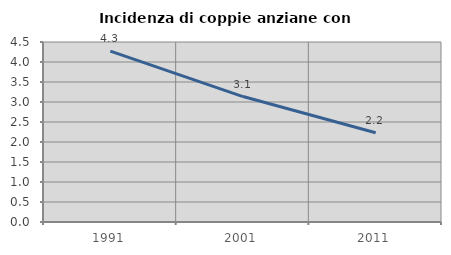
| Category | Incidenza di coppie anziane con figli |
|---|---|
| 1991.0 | 4.27 |
| 2001.0 | 3.136 |
| 2011.0 | 2.23 |